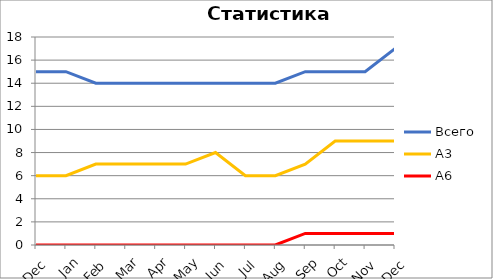
| Category | Всего | А3 | A6 |
|---|---|---|---|
| 0 | 15 | 6 | 0 |
| 1 | 15 | 6 | 0 |
| 2 | 14 | 7 | 0 |
| 3 | 14 | 7 | 0 |
| 4 | 14 | 7 | 0 |
| 5 | 14 | 7 | 0 |
| 6 | 14 | 8 | 0 |
| 7 | 14 | 6 | 0 |
| 8 | 14 | 6 | 0 |
| 9 | 15 | 7 | 1 |
| 10 | 15 | 9 | 1 |
| 11 | 15 | 9 | 1 |
| 12 | 17 | 9 | 1 |